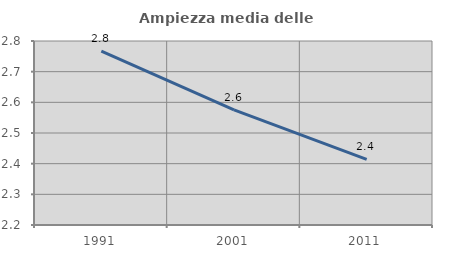
| Category | Ampiezza media delle famiglie |
|---|---|
| 1991.0 | 2.767 |
| 2001.0 | 2.576 |
| 2011.0 | 2.414 |